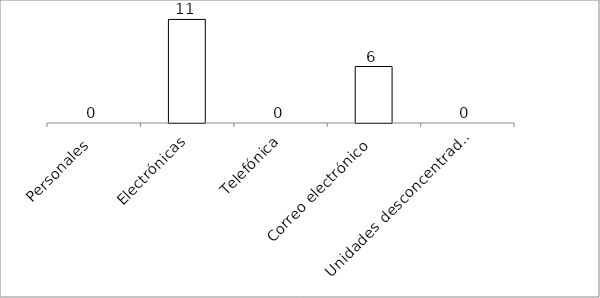
| Category | Series 0 |
|---|---|
| Personales | 0 |
| Electrónicas | 11 |
| Telefónica | 0 |
| Correo electrónico | 6 |
| Unidades desconcentradas | 0 |